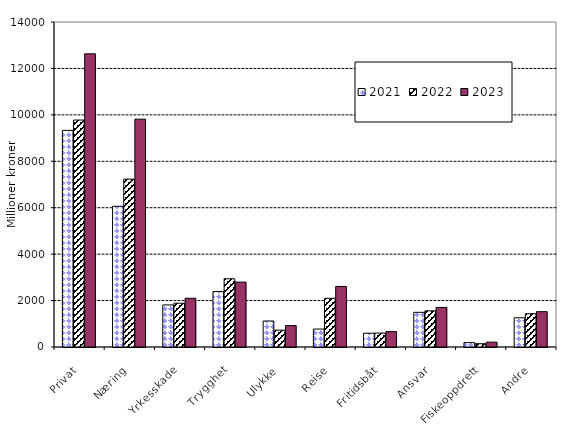
| Category | 2021 | 2022 | 2023 |
|---|---|---|---|
| Privat | 9329.626 | 9776.708 | 12630.226 |
| Næring | 6062.059 | 7230.909 | 9813.979 |
| Yrkesskade | 1811.924 | 1885.308 | 2098.33 |
| Trygghet | 2387.385 | 2938.864 | 2795.194 |
| Ulykke | 1120.298 | 724.487 | 922.019 |
| Reise | 773.788 | 2098.277 | 2609.279 |
| Fritidsbåt | 593.006 | 599.946 | 662.091 |
| Ansvar | 1493.658 | 1558.65 | 1705.128 |
| Fiskeoppdrett | 189.004 | 141.561 | 207.469 |
| Andre | 1258.06 | 1434.656 | 1521.886 |